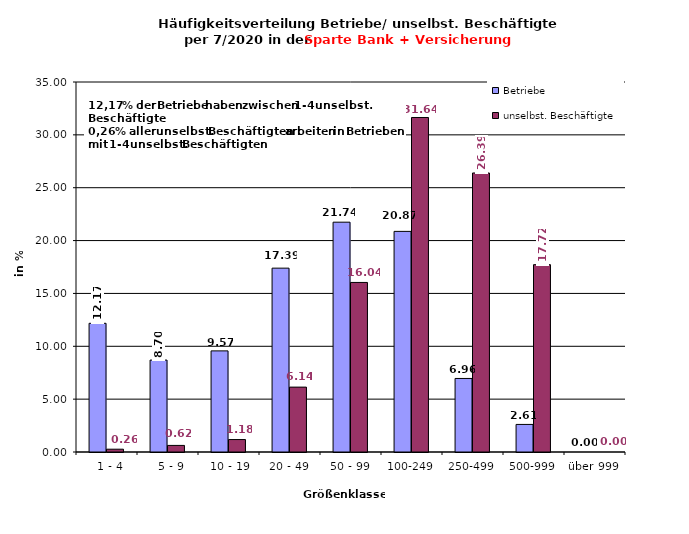
| Category | Betriebe | unselbst. Beschäftigte |
|---|---|---|
|   1 - 4 | 12.174 | 0.265 |
|   5 - 9 | 8.696 | 0.623 |
|  10 - 19 | 9.565 | 1.178 |
| 20 - 49 | 17.391 | 6.137 |
| 50 - 99 | 21.739 | 16.039 |
| 100-249 | 20.87 | 31.643 |
| 250-499 | 6.957 | 26.394 |
| 500-999 | 2.609 | 17.721 |
| über 999 | 0 | 0 |